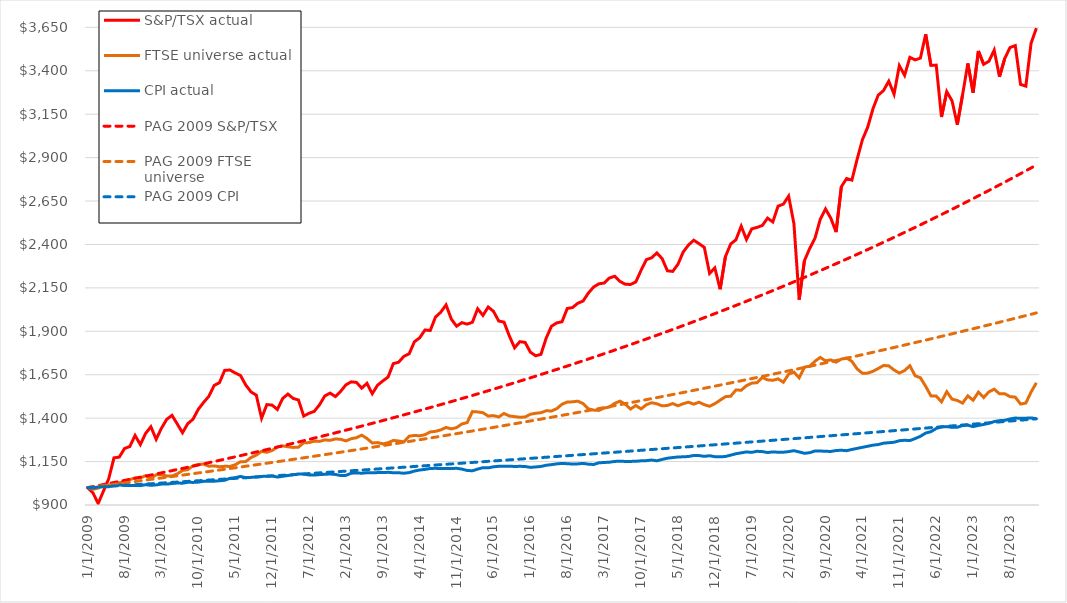
| Category | S&P/TSX actual | FTSE universe actual | CPI actual | PAG 2009 S&P/TSX | PAG 2009 FTSE universe | PAG 2009 CPI |
|---|---|---|---|---|---|---|
| 1/1/09 | 1000 | 1000 | 1000 | 1000 | 1000 | 1000 |
| 2/1/09 | 970.389 | 990.472 | 997.352 | 1005.85 | 1003.875 | 1001.856 |
| 3/1/09 | 909.15 | 997.266 | 1004.413 | 1011.734 | 1007.764 | 1003.715 |
| 4/1/09 | 979.96 | 1015.227 | 1006.178 | 1017.652 | 1011.669 | 1005.578 |
| 5/1/09 | 1051.114 | 1015.453 | 1005.296 | 1023.605 | 1015.589 | 1007.444 |
| 6/1/09 | 1171.605 | 1014.099 | 1012.357 | 1029.593 | 1019.524 | 1009.314 |
| 7/1/09 | 1175.638 | 1027.942 | 1015.887 | 1035.616 | 1023.474 | 1011.187 |
| 8/1/09 | 1225.223 | 1034.744 | 1012.357 | 1041.674 | 1027.44 | 1013.064 |
| 9/1/09 | 1236.826 | 1046.409 | 1012.357 | 1047.767 | 1031.421 | 1014.944 |
| 10/1/09 | 1300.415 | 1055.838 | 1012.357 | 1053.897 | 1035.418 | 1016.828 |
| 11/1/09 | 1247.834 | 1055.218 | 1011.474 | 1060.062 | 1039.429 | 1018.715 |
| 12/1/09 | 1312.158 | 1069.3 | 1016.77 | 1066.263 | 1043.457 | 1020.606 |
| 1/1/10 | 1350.55 | 1054.103 | 1013.239 | 1072.5 | 1047.5 | 1022.5 |
| 2/1/10 | 1278.324 | 1073.523 | 1015.887 | 1078.774 | 1051.559 | 1024.398 |
| 3/1/10 | 1341.895 | 1075.166 | 1020.3 | 1085.084 | 1055.633 | 1026.299 |
| 4/1/10 | 1392.993 | 1067.358 | 1020.3 | 1091.432 | 1059.723 | 1028.204 |
| 5/1/10 | 1416.196 | 1066.704 | 1023.831 | 1097.816 | 1063.83 | 1030.112 |
| 6/1/10 | 1366.937 | 1079.247 | 1026.478 | 1104.238 | 1067.952 | 1032.024 |
| 7/1/10 | 1316.175 | 1098.634 | 1025.596 | 1110.698 | 1072.09 | 1033.939 |
| 8/1/10 | 1368.282 | 1103.722 | 1030.891 | 1117.195 | 1076.244 | 1035.858 |
| 9/1/10 | 1394.237 | 1125.929 | 1030.009 | 1123.73 | 1080.414 | 1037.781 |
| 10/1/10 | 1451.235 | 1133.263 | 1031.774 | 1130.304 | 1084.6 | 1039.707 |
| 11/1/10 | 1490.571 | 1135.796 | 1036.187 | 1136.916 | 1088.802 | 1041.636 |
| 12/1/10 | 1525.903 | 1123.379 | 1037.07 | 1143.567 | 1093.021 | 1043.569 |
| 1/1/11 | 1588.325 | 1125.195 | 1037.07 | 1150.256 | 1097.256 | 1045.506 |
| 2/1/11 | 1603.988 | 1120.233 | 1039.718 | 1156.985 | 1101.508 | 1047.447 |
| 3/1/11 | 1675.155 | 1122.807 | 1042.365 | 1163.753 | 1105.776 | 1049.391 |
| 4/1/11 | 1677.242 | 1122.121 | 1053.839 | 1170.561 | 1110.06 | 1051.338 |
| 5/1/11 | 1660.106 | 1131.702 | 1057.37 | 1177.408 | 1114.361 | 1053.289 |
| 6/1/11 | 1645.706 | 1149.176 | 1064.431 | 1184.296 | 1118.679 | 1055.244 |
| 7/1/11 | 1590.9 | 1149.934 | 1057.37 | 1191.223 | 1123.014 | 1057.203 |
| 8/1/11 | 1551.154 | 1173.429 | 1059.135 | 1198.192 | 1127.365 | 1059.165 |
| 9/1/11 | 1532.403 | 1187.243 | 1061.783 | 1205.201 | 1131.733 | 1061.131 |
| 10/1/11 | 1399.676 | 1208.765 | 1064.431 | 1212.251 | 1136.118 | 1063.1 |
| 11/1/11 | 1478.156 | 1203.545 | 1066.196 | 1219.342 | 1140.52 | 1065.073 |
| 12/1/11 | 1475.034 | 1213.612 | 1067.079 | 1226.475 | 1144.94 | 1067.05 |
| 1/1/12 | 1449.973 | 1234.047 | 1060.9 | 1233.65 | 1149.376 | 1069.03 |
| 2/1/12 | 1513.379 | 1240.31 | 1065.313 | 1240.866 | 1153.829 | 1071.014 |
| 3/1/12 | 1538.704 | 1235.363 | 1069.726 | 1248.125 | 1158.3 | 1073.002 |
| 4/1/12 | 1513.622 | 1231.43 | 1074.139 | 1255.426 | 1162.788 | 1074.993 |
| 5/1/12 | 1504.596 | 1233.003 | 1078.553 | 1262.77 | 1167.294 | 1076.988 |
| 6/1/12 | 1412.214 | 1259 | 1077.67 | 1270.157 | 1171.816 | 1078.987 |
| 7/1/12 | 1427.763 | 1259.129 | 1073.257 | 1277.587 | 1176.357 | 1080.99 |
| 8/1/12 | 1439.188 | 1267.466 | 1072.374 | 1285.061 | 1180.915 | 1082.996 |
| 9/1/12 | 1477.294 | 1266.165 | 1075.022 | 1292.578 | 1185.491 | 1085.006 |
| 10/1/12 | 1527.962 | 1274.688 | 1076.787 | 1300.139 | 1190.084 | 1087.02 |
| 11/1/12 | 1544.286 | 1272.271 | 1078.553 | 1307.745 | 1194.695 | 1089.037 |
| 12/1/12 | 1524.486 | 1280.179 | 1075.905 | 1315.395 | 1199.324 | 1091.058 |
| 1/1/13 | 1554.195 | 1278.477 | 1069.726 | 1323.089 | 1203.971 | 1093.083 |
| 2/1/13 | 1591.657 | 1268.796 | 1070.609 | 1330.829 | 1208.636 | 1095.112 |
| 3/1/13 | 1609.15 | 1281.666 | 1082.966 | 1338.614 | 1213.319 | 1097.144 |
| 4/1/13 | 1606.052 | 1287.343 | 1084.731 | 1346.445 | 1218.021 | 1099.181 |
| 5/1/13 | 1572.791 | 1302.043 | 1082.966 | 1354.321 | 1222.74 | 1101.221 |
| 6/1/13 | 1600.631 | 1282.996 | 1085.613 | 1362.244 | 1227.478 | 1103.265 |
| 7/1/13 | 1540.502 | 1256.998 | 1085.613 | 1370.212 | 1232.234 | 1105.312 |
| 8/1/13 | 1589.598 | 1259.358 | 1086.496 | 1378.228 | 1237.008 | 1107.363 |
| 9/1/13 | 1614.21 | 1251.865 | 1086.496 | 1386.29 | 1241.801 | 1109.419 |
| 10/1/13 | 1636.779 | 1258.414 | 1088.261 | 1394.399 | 1246.613 | 1111.478 |
| 11/1/13 | 1714.103 | 1271.642 | 1085.613 | 1402.556 | 1251.443 | 1113.541 |
| 12/1/13 | 1721.861 | 1268.639 | 1085.613 | 1410.761 | 1256.292 | 1115.607 |
| 1/1/14 | 1756.114 | 1263.219 | 1082.966 | 1419.013 | 1261.16 | 1117.678 |
| 2/1/14 | 1770.448 | 1296.109 | 1086.496 | 1427.314 | 1266.047 | 1119.752 |
| 3/1/14 | 1839.96 | 1300.642 | 1095.322 | 1435.664 | 1270.952 | 1121.83 |
| 4/1/14 | 1862.552 | 1298.168 | 1101.5 | 1444.062 | 1275.877 | 1123.912 |
| 5/1/14 | 1907.701 | 1304.746 | 1105.031 | 1452.509 | 1280.82 | 1125.998 |
| 6/1/14 | 1904.562 | 1320.719 | 1110.327 | 1461.006 | 1285.783 | 1128.088 |
| 7/1/14 | 1982.003 | 1324.065 | 1111.209 | 1469.553 | 1290.765 | 1130.182 |
| 8/1/14 | 2010.162 | 1332.417 | 1109.444 | 1478.149 | 1295.766 | 1132.279 |
| 9/1/14 | 2052.135 | 1346.631 | 1109.444 | 1486.796 | 1300.787 | 1134.381 |
| 10/1/14 | 1970.33 | 1338.151 | 1110.327 | 1495.493 | 1305.827 | 1136.486 |
| 11/1/14 | 1929.571 | 1345.773 | 1111.209 | 1504.242 | 1310.887 | 1138.595 |
| 12/1/14 | 1950.05 | 1366.608 | 1106.796 | 1513.041 | 1315.966 | 1140.708 |
| 1/1/15 | 1941.448 | 1374.258 | 1098.853 | 1521.892 | 1321.065 | 1142.825 |
| 2/1/15 | 1952.105 | 1437.836 | 1097.087 | 1530.795 | 1326.184 | 1144.946 |
| 3/1/15 | 2029.771 | 1435.906 | 1106.796 | 1539.749 | 1331.322 | 1147.071 |
| 4/1/15 | 1991.613 | 1431.344 | 1114.74 | 1548.756 | 1336.481 | 1149.2 |
| 5/1/15 | 2039.96 | 1411.853 | 1113.857 | 1557.816 | 1341.659 | 1151.333 |
| 6/1/15 | 2015.117 | 1414.684 | 1120.035 | 1566.929 | 1346.858 | 1153.47 |
| 7/1/15 | 1959.052 | 1406.834 | 1122.683 | 1576.095 | 1352.076 | 1155.611 |
| 8/1/15 | 1952.869 | 1427.04 | 1123.566 | 1585.315 | 1357.315 | 1157.755 |
| 9/1/15 | 1874.032 | 1412.697 | 1123.566 | 1594.589 | 1362.574 | 1159.904 |
| 10/1/15 | 1805.164 | 1408.879 | 1121.801 | 1603.917 | 1367.854 | 1162.057 |
| 11/1/15 | 1840.471 | 1405.261 | 1122.683 | 1613.299 | 1373.154 | 1164.214 |
| 12/1/15 | 1836.236 | 1406.676 | 1121.801 | 1622.736 | 1378.474 | 1166.374 |
| 1/1/16 | 1779.949 | 1422.635 | 1116.505 | 1632.229 | 1383.816 | 1168.539 |
| 2/1/16 | 1759.146 | 1428.169 | 1119.153 | 1641.777 | 1389.177 | 1170.708 |
| 3/1/16 | 1767.379 | 1431.23 | 1121.801 | 1651.381 | 1394.56 | 1172.881 |
| 4/1/16 | 1860.752 | 1442.469 | 1128.861 | 1661.041 | 1399.964 | 1175.057 |
| 5/1/16 | 1929.174 | 1441.325 | 1132.392 | 1670.758 | 1405.388 | 1177.238 |
| 6/1/16 | 1948.393 | 1454.424 | 1136.805 | 1680.531 | 1410.833 | 1179.423 |
| 7/1/16 | 1955.062 | 1480.207 | 1139.453 | 1690.362 | 1416.3 | 1181.612 |
| 8/1/16 | 2031.434 | 1492.691 | 1137.688 | 1700.25 | 1421.788 | 1183.805 |
| 9/1/16 | 2036.859 | 1494.049 | 1135.922 | 1710.196 | 1427.297 | 1186.002 |
| 10/1/16 | 2061.694 | 1497.753 | 1136.805 | 1720.201 | 1432.827 | 1188.203 |
| 11/1/16 | 2074.431 | 1484.168 | 1139.453 | 1730.263 | 1438.379 | 1190.408 |
| 12/1/16 | 2119.944 | 1453.509 | 1135.04 | 1740.385 | 1443.952 | 1192.618 |
| 1/1/17 | 2155.197 | 1446.287 | 1133.274 | 1750.566 | 1449.547 | 1194.831 |
| 2/1/17 | 2173.486 | 1444.529 | 1142.983 | 1760.806 | 1455.163 | 1197.049 |
| 3/1/17 | 2178.097 | 1458.328 | 1144.748 | 1771.106 | 1460.802 | 1199.27 |
| 4/1/17 | 2207.217 | 1464.248 | 1146.514 | 1781.467 | 1466.462 | 1201.496 |
| 5/1/17 | 2216.919 | 1485.255 | 1150.927 | 1791.888 | 1472.144 | 1203.726 |
| 6/1/17 | 2187.542 | 1497.982 | 1151.809 | 1802.37 | 1477.848 | 1205.96 |
| 7/1/17 | 2171.043 | 1480.479 | 1150.927 | 1812.913 | 1483.574 | 1208.198 |
| 8/1/17 | 2169.719 | 1452.322 | 1150.927 | 1823.518 | 1489.323 | 1210.441 |
| 9/1/17 | 2184.209 | 1472.771 | 1151.809 | 1834.186 | 1495.093 | 1212.687 |
| 10/1/17 | 2251.033 | 1453.28 | 1154.457 | 1844.915 | 1500.886 | 1214.938 |
| 11/1/17 | 2312.521 | 1477.161 | 1155.34 | 1855.707 | 1506.702 | 1217.193 |
| 12/1/17 | 2323.439 | 1488.787 | 1158.87 | 1866.563 | 1512.54 | 1219.452 |
| 1/1/18 | 2351.216 | 1482.681 | 1154.457 | 1877.482 | 1518.4 | 1221.715 |
| 2/1/18 | 2318.417 | 1470.826 | 1162.401 | 1888.464 | 1524.284 | 1223.982 |
| 3/1/18 | 2248.504 | 1473 | 1169.462 | 1899.511 | 1530.19 | 1226.254 |
| 4/1/18 | 2244.952 | 1484.125 | 1172.992 | 1910.623 | 1536.119 | 1228.53 |
| 5/1/18 | 2285.838 | 1471.413 | 1176.523 | 1921.8 | 1542.071 | 1230.81 |
| 6/1/18 | 2357.046 | 1483.253 | 1177.405 | 1933.042 | 1548.046 | 1233.094 |
| 7/1/18 | 2396.96 | 1491.747 | 1179.17 | 1944.35 | 1554.044 | 1235.383 |
| 8/1/18 | 2424.525 | 1480.779 | 1185.349 | 1955.724 | 1560.065 | 1237.675 |
| 9/1/18 | 2404.643 | 1491.904 | 1184.466 | 1967.164 | 1566.11 | 1239.973 |
| 10/1/18 | 2383.256 | 1477.476 | 1180.053 | 1978.671 | 1572.178 | 1242.274 |
| 11/1/18 | 2233.725 | 1468.41 | 1183.583 | 1990.246 | 1578.27 | 1244.579 |
| 12/1/18 | 2264.666 | 1483.453 | 1178.288 | 2001.889 | 1584.385 | 1246.889 |
| 1/1/19 | 2142.281 | 1503.559 | 1177.405 | 2013.599 | 1590.524 | 1249.203 |
| 2/1/19 | 2329.416 | 1523.65 | 1179.17 | 2025.378 | 1596.687 | 1251.522 |
| 3/1/19 | 2402.749 | 1526.425 | 1187.114 | 2037.226 | 1602.874 | 1253.845 |
| 4/1/19 | 2427.096 | 1562.346 | 1195.057 | 2049.143 | 1609.084 | 1256.172 |
| 5/1/19 | 2505.267 | 1560.745 | 1200.353 | 2061.13 | 1615.319 | 1258.503 |
| 6/1/19 | 2428.506 | 1587.157 | 1205.649 | 2073.187 | 1621.578 | 1260.839 |
| 7/1/19 | 2489.836 | 1601.62 | 1203.001 | 2085.315 | 1627.861 | 1263.179 |
| 8/1/19 | 2498.382 | 1604.307 | 1209.179 | 2097.514 | 1634.168 | 1265.523 |
| 9/1/19 | 2509.235 | 1634.39 | 1207.414 | 2109.783 | 1640.5 | 1267.872 |
| 10/1/19 | 2551.598 | 1620.663 | 1202.118 | 2122.125 | 1646.857 | 1270.225 |
| 11/1/19 | 2529.664 | 1617.862 | 1205.649 | 2134.539 | 1653.238 | 1272.582 |
| 12/1/19 | 2620.47 | 1626.224 | 1203.883 | 2147.025 | 1659.644 | 1274.944 |
| 1/1/20 | 2632.371 | 1606.865 | 1203.883 | 2159.585 | 1666.074 | 1277.311 |
| 2/1/20 | 2678.29 | 1653.587 | 1207.414 | 2172.218 | 1672.53 | 1279.681 |
| 3/1/20 | 2520.229 | 1665.319 | 1212.71 | 2184.925 | 1679.01 | 1282.056 |
| 4/1/20 | 2082.306 | 1632.004 | 1205.649 | 2197.706 | 1685.516 | 1284.436 |
| 5/1/20 | 2307.031 | 1693.786 | 1197.705 | 2210.562 | 1692.047 | 1286.819 |
| 6/1/20 | 2377.152 | 1699.087 | 1201.236 | 2223.493 | 1698.603 | 1289.208 |
| 7/1/20 | 2435.698 | 1727.82 | 1210.944 | 2236.5 | 1705.184 | 1291.6 |
| 8/1/20 | 2544.89 | 1749.736 | 1210.944 | 2249.583 | 1711.792 | 1293.997 |
| 9/1/20 | 2604.656 | 1729.957 | 1209.179 | 2262.743 | 1718.424 | 1296.399 |
| 10/1/20 | 2550.957 | 1735.422 | 1208.297 | 2275.979 | 1725.083 | 1298.805 |
| 11/1/20 | 2471.514 | 1722.296 | 1213.592 | 2289.293 | 1731.767 | 1301.216 |
| 12/1/20 | 2732.699 | 1740.001 | 1215.357 | 2302.685 | 1738.477 | 1303.631 |
| 1/1/21 | 2779.789 | 1746.367 | 1212.71 | 2316.155 | 1745.213 | 1306.05 |
| 2/1/21 | 2770.828 | 1727.021 | 1219.771 | 2329.704 | 1751.975 | 1308.474 |
| 3/1/21 | 2891.766 | 1683.469 | 1225.949 | 2343.332 | 1758.763 | 1310.902 |
| 4/1/21 | 3003.633 | 1658.395 | 1232.127 | 2357.04 | 1765.578 | 1313.335 |
| 5/1/21 | 3075.412 | 1659.36 | 1238.305 | 2370.828 | 1772.419 | 1315.773 |
| 6/1/21 | 3181.308 | 1669.821 | 1244.484 | 2384.697 | 1779.287 | 1318.215 |
| 7/1/21 | 3260.255 | 1685.84 | 1248.014 | 2398.647 | 1786.181 | 1320.661 |
| 8/1/21 | 3286.445 | 1703.204 | 1255.958 | 2412.678 | 1793.102 | 1323.112 |
| 9/1/21 | 3340.109 | 1701.088 | 1258.605 | 2426.792 | 1800.049 | 1325.568 |
| 10/1/21 | 3265.807 | 1677.351 | 1261.253 | 2440.988 | 1807.024 | 1328.028 |
| 11/1/21 | 3429.605 | 1659.675 | 1270.079 | 2455.267 | 1814.026 | 1330.493 |
| 12/1/21 | 3373.991 | 1674.101 | 1272.727 | 2469.629 | 1821.054 | 1332.962 |
| 1/1/22 | 3477.264 | 1701.937 | 1270.962 | 2484.076 | 1828.11 | 1335.436 |
| 2/1/22 | 3462.951 | 1644.071 | 1282.436 | 2498.607 | 1835.194 | 1337.915 |
| 3/1/22 | 3472.645 | 1632.345 | 1295.675 | 2513.224 | 1842.305 | 1340.398 |
| 4/1/22 | 3610.012 | 1583.354 | 1314.21 | 2527.925 | 1849.443 | 1342.885 |
| 5/1/22 | 3430.886 | 1528.241 | 1322.154 | 2542.713 | 1856.609 | 1345.378 |
| 6/1/22 | 3432.843 | 1527.197 | 1340.688 | 2557.587 | 1863.803 | 1347.875 |
| 7/1/22 | 3134 | 1493.892 | 1349.515 | 2572.548 | 1871.024 | 1350.376 |
| 8/1/22 | 3279.923 | 1552.208 | 1351.28 | 2587.597 | 1878.274 | 1352.882 |
| 9/1/22 | 3227.216 | 1509.651 | 1346.867 | 2602.734 | 1885.552 | 1355.393 |
| 10/1/22 | 3089.84 | 1501.671 | 1347.749 | 2617.959 | 1892.858 | 1357.909 |
| 11/1/22 | 3261.986 | 1486.613 | 1357.458 | 2633.274 | 1900.192 | 1360.429 |
| 12/1/22 | 3442.654 | 1528.455 | 1359.223 | 2648.678 | 1907.554 | 1362.954 |
| 1/1/23 | 3274.129 | 1503.216 | 1351.28 | 2664.172 | 1914.946 | 1365.483 |
| 2/1/23 | 3514.037 | 1549.662 | 1358.341 | 2679.756 | 1922.365 | 1368.018 |
| 3/1/23 | 3437.21 | 1518.774 | 1363.636 | 2695.432 | 1929.814 | 1370.557 |
| 4/1/23 | 3455.055 | 1551.578 | 1370.697 | 2711.2 | 1937.291 | 1373.1 |
| 5/1/23 | 3518.966 | 1566.779 | 1380.406 | 2727.06 | 1944.798 | 1375.649 |
| 6/1/23 | 3365.818 | 1540.31 | 1385.702 | 2743.012 | 1952.333 | 1378.202 |
| 7/1/23 | 3470.811 | 1540.925 | 1387.467 | 2759.058 | 1959.898 | 1380.76 |
| 8/1/23 | 3533.88 | 1523.879 | 1395.41 | 2775.198 | 1967.492 | 1383.322 |
| 9/1/23 | 3544.996 | 1521.076 | 1400.706 | 2791.432 | 1975.115 | 1385.89 |
| 10/1/23 | 3321.58 | 1481.28 | 1398.941 | 2807.761 | 1982.768 | 1388.462 |
| 11/1/23 | 3311.692 | 1486.771 | 1399.823 | 2824.186 | 1990.451 | 1391.039 |
| 12/1/23 | 3558.879 | 1550.592 | 1401.589 | 2840.707 | 1998.163 | 1393.62 |
| 1/1/24 | 3645.378 | 1603.773 | 1397.176 | 2857.324 | 2005.906 | 1396.207 |